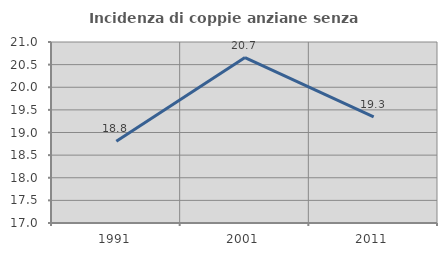
| Category | Incidenza di coppie anziane senza figli  |
|---|---|
| 1991.0 | 18.809 |
| 2001.0 | 20.656 |
| 2011.0 | 19.344 |